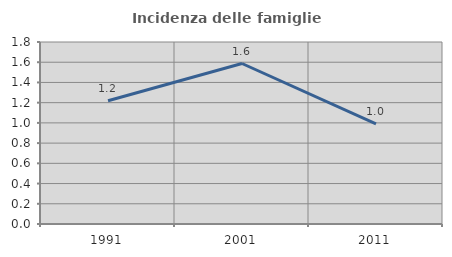
| Category | Incidenza delle famiglie numerose |
|---|---|
| 1991.0 | 1.22 |
| 2001.0 | 1.587 |
| 2011.0 | 0.99 |